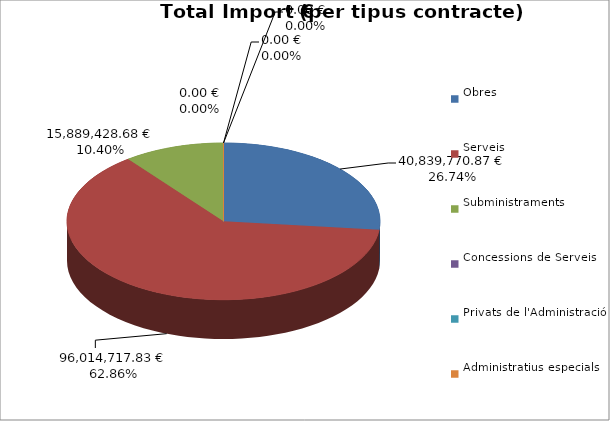
| Category | Total preu
(amb IVA) |
|---|---|
| Obres | 40839770.873 |
| Serveis | 96014717.826 |
| Subministraments | 15889428.678 |
| Concessions de Serveis | 0 |
| Privats de l'Administració | 0 |
| Administratius especials | 0 |